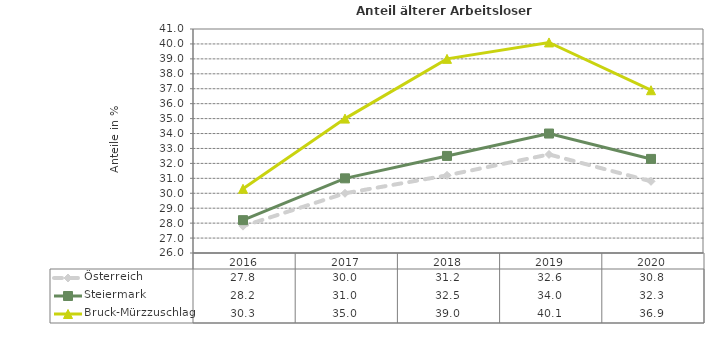
| Category | Österreich | Steiermark | Bruck-Mürzzuschlag |
|---|---|---|---|
| 2020.0 | 30.8 | 32.3 | 36.9 |
| 2019.0 | 32.6 | 34 | 40.1 |
| 2018.0 | 31.2 | 32.5 | 39 |
| 2017.0 | 30 | 31 | 35 |
| 2016.0 | 27.8 | 28.2 | 30.3 |